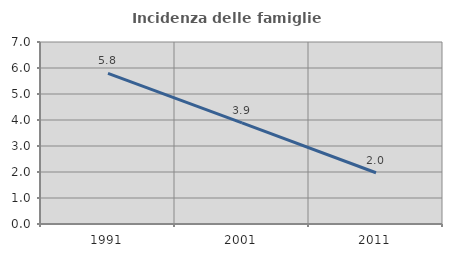
| Category | Incidenza delle famiglie numerose |
|---|---|
| 1991.0 | 5.794 |
| 2001.0 | 3.888 |
| 2011.0 | 1.971 |